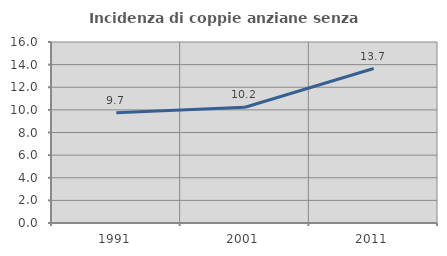
| Category | Incidenza di coppie anziane senza figli  |
|---|---|
| 1991.0 | 9.746 |
| 2001.0 | 10.236 |
| 2011.0 | 13.653 |